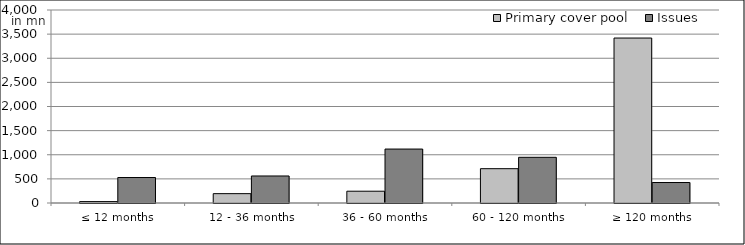
| Category | Primary cover pool | Issues |
|---|---|---|
| ≤ 12 months | 28880624.96 | 528000000 |
| 12 - 36 months | 193670895.765 | 560150000 |
| 36 - 60 months | 244483902.591 | 1118000000 |
| 60 - 120 months | 711152410.81 | 947000000 |
| ≥ 120 months | 3418877430.82 | 424513930.65 |